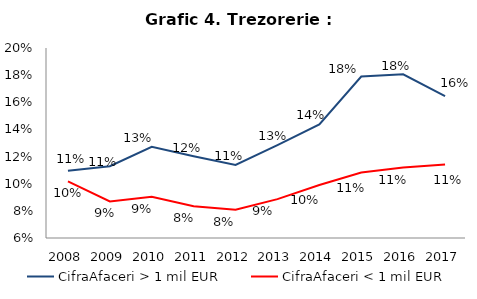
| Category | CifraAfaceri > 1 mil EUR | CifraAfaceri < 1 mil EUR |
|---|---|---|
| 2008.0 | 0.11 | 0.102 |
| 2009.0 | 0.113 | 0.087 |
| 2010.0 | 0.127 | 0.09 |
| 2011.0 | 0.12 | 0.083 |
| 2012.0 | 0.114 | 0.081 |
| 2013.0 | 0.128 | 0.089 |
| 2014.0 | 0.144 | 0.099 |
| 2015.0 | 0.179 | 0.108 |
| 2016.0 | 0.181 | 0.112 |
| 2017.0 | 0.165 | 0.114 |